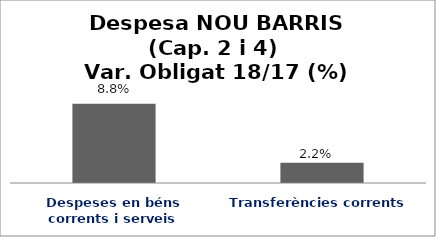
| Category | Series 0 |
|---|---|
| Despeses en béns corrents i serveis | 0.088 |
| Transferències corrents | 0.022 |